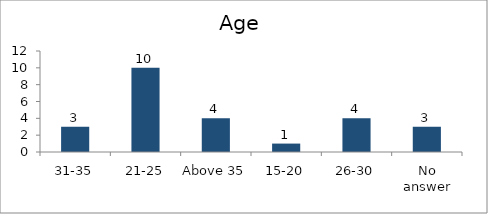
| Category | Age |
|---|---|
| 31-35 | 3 |
| 21-25 | 10 |
| Above 35 | 4 |
| 15-20 | 1 |
| 26-30 | 4 |
| No answer | 3 |